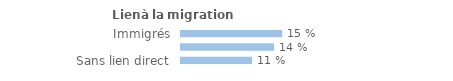
| Category | Series 0 |
|---|---|
| Immigrés | 0.15 |
| Descendants d'immigré(s) | 0.138 |
| Sans lien direct | 0.106 |